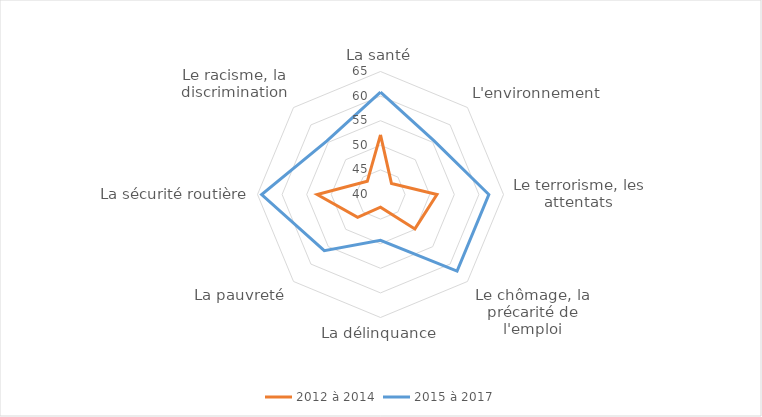
| Category | 2012 à 2014 | 2015 à 2017 |
|---|---|---|
| La santé | 52.11 | 60.8 |
| L'environnement | 43.16 | 55.41 |
| Le terrorisme, les attentats | 51.47 | 62.02 |
| Le chômage, la précarité de l'emploi | 49.89 | 62.01 |
| La délinquance | 42.57 | 49.3 |
| La pauvreté | 46.57 | 56.16 |
| La sécurité routière | 52.86 | 64.16 |
| Le racisme, la discrimination | 43.79 | 55.39 |